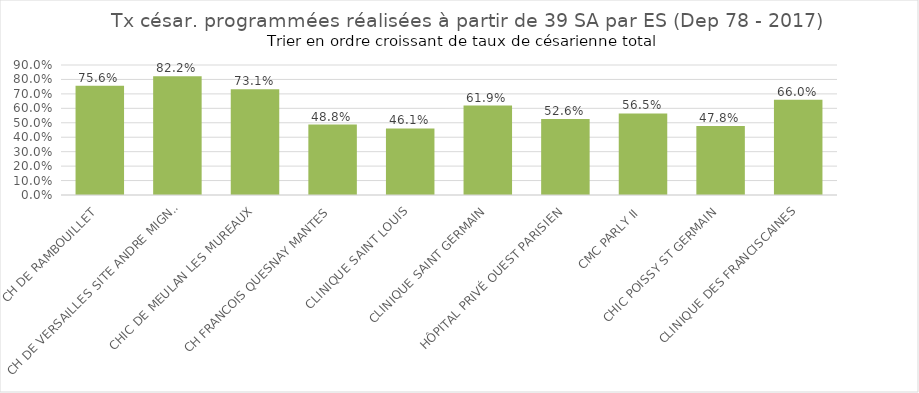
| Category | Tx césar. programmées 
réalisées à partir de 39 SA |
|---|---|
| CH DE RAMBOUILLET | 0.756 |
| CH DE VERSAILLES SITE ANDRE MIGNOT | 0.822 |
| CHIC DE MEULAN LES MUREAUX | 0.731 |
| CH FRANCOIS QUESNAY MANTES | 0.488 |
| CLINIQUE SAINT LOUIS | 0.461 |
| CLINIQUE SAINT GERMAIN | 0.619 |
| HÔPITAL PRIVÉ OUEST PARISIEN | 0.526 |
| CMC PARLY II | 0.565 |
| CHIC POISSY ST GERMAIN | 0.478 |
| CLINIQUE DES FRANCISCAINES | 0.66 |